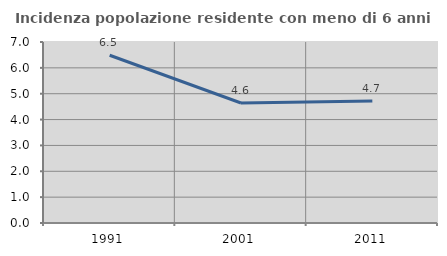
| Category | Incidenza popolazione residente con meno di 6 anni |
|---|---|
| 1991.0 | 6.489 |
| 2001.0 | 4.641 |
| 2011.0 | 4.722 |